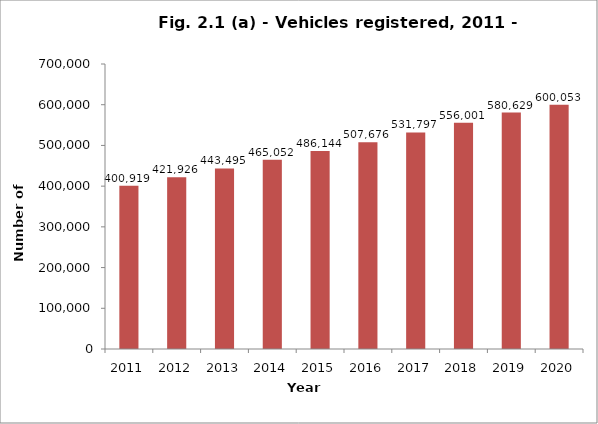
| Category | Vehicles |
|---|---|
| 2011.0 | 400919 |
| 2012.0 | 421926 |
| 2013.0 | 443495 |
| 2014.0 | 465052 |
| 2015.0 | 486144 |
| 2016.0 | 507676 |
| 2017.0 | 531797 |
| 2018.0 | 556001 |
| 2019.0 | 580629 |
| 2020.0 | 600053 |